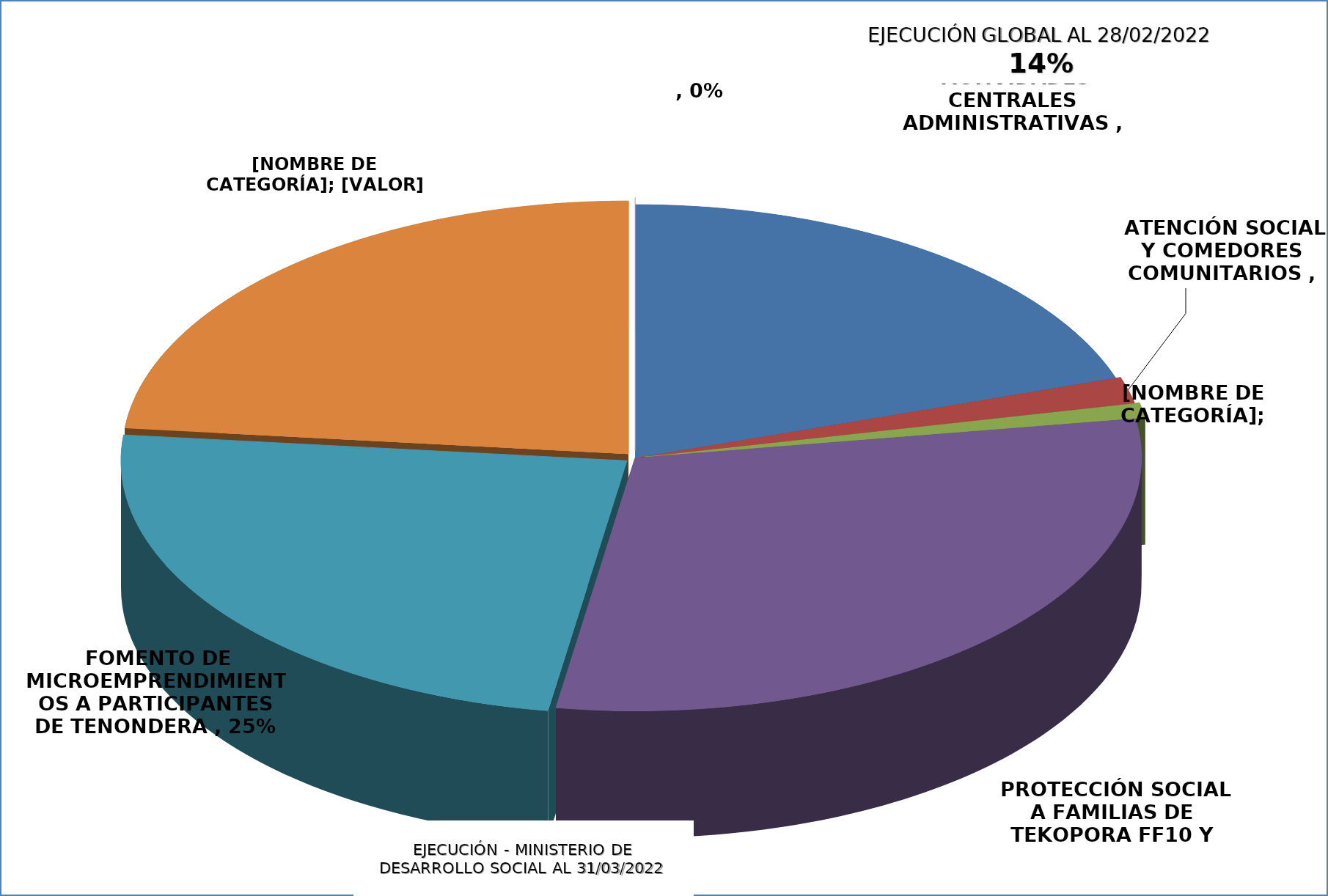
| Category |  EJECUCIÓN - MINISTERIO DE DESARROLLO SOCIAL  |
|---|---|
|  ACTIVIDADES CENTRALES ADMINISTRATIVAS  | 0.208 |
|  ATENCIÓN SOCIAL Y COMEDORES COMUNITARIOS  | 0.018 |
|  ASISTENCIA A PESCADORES POR VEDA PESQUERA  | 0.01 |
|  PROTECCIÓN SOCIAL A FAMILIAS DE TEKOPORA FF10 Y FF20  | 0.313 |
|  FOMENTO DE MICROEMPRENDIMIENTOS A PARTICIPANTES DE TENONDERA  | 0.252 |
|  REGULARIZACIÓN DE TERRITORIOS SOCIALES, TEKOHA  | 0.244 |